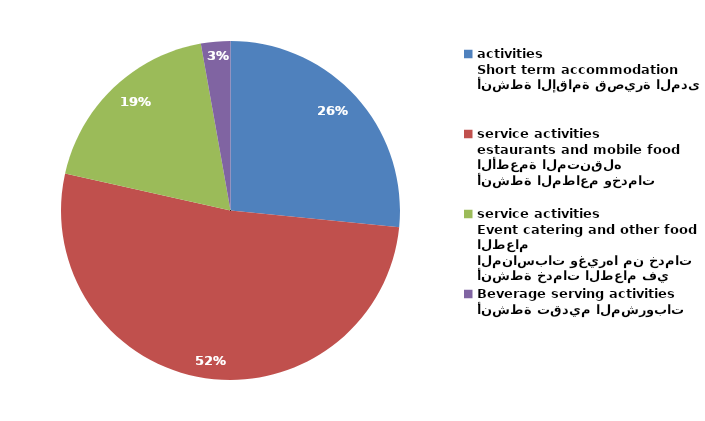
| Category | Series 0 |
|---|---|
| أنشطة الإقامة قصيرة المدى
Short term accommodation activities | 20776 |
| أنشطة المطاعم وخدمات الأطعمة المتنقله
estaurants and mobile food service activities | 40614 |
| أنشطة خدمات الطعام في المناسبات وغيرها من خدمات الطعام
Event catering and other food service activities | 14612 |
| أنشطة تقديم المشروبات
Beverage serving activities | 2192 |